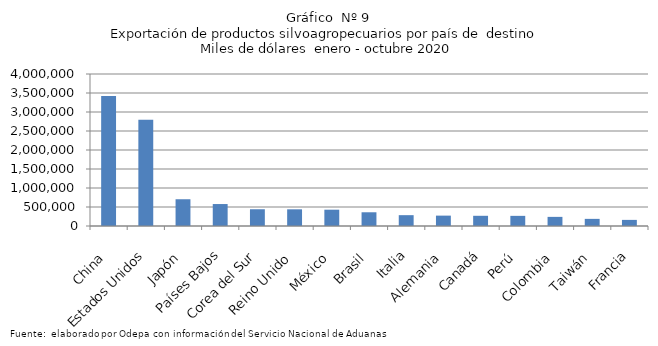
| Category | Series 0 |
|---|---|
| China | 3422053.916 |
| Estados Unidos | 2795778.243 |
| Japón | 703934.93 |
| Países Bajos | 577955.928 |
| Corea del Sur | 440749.775 |
| Reino Unido | 438954.315 |
| México | 429200.608 |
| Brasil | 361271.391 |
| Italia | 285191.343 |
| Alemania | 273080.203 |
| Canadá | 268472.405 |
| Perú | 266882.759 |
| Colombia | 240104.126 |
| Taiwán | 187702.33 |
| Francia | 160714.681 |